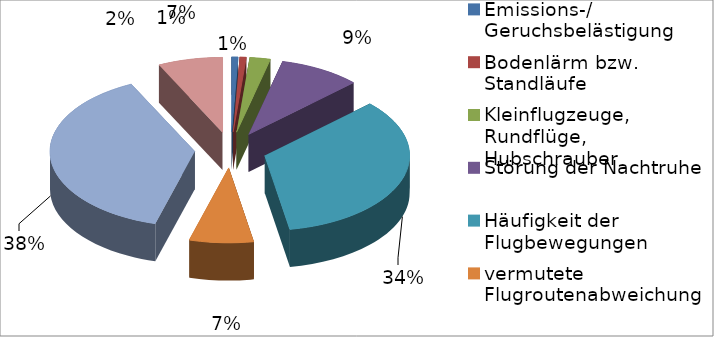
| Category | Series 0 |
|---|---|
| Emissions-/ Geruchsbelästigung | 21 |
| Bodenlärm bzw. Standläufe | 21 |
| Kleinflugzeuge, Rundflüge, Hubschrauber | 67 |
| Störung der Nachtruhe | 265 |
| Häufigkeit der Flugbewegungen | 997 |
| vermutete Flugroutenabweichung | 208 |
| zu tief, bzw. zu laut empfundene Flugzeuge | 1114 |
| Sonstige | 210 |